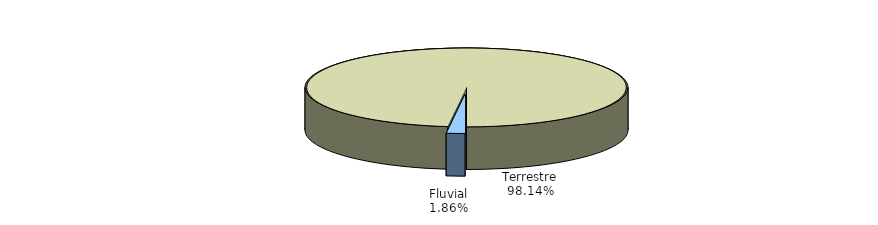
| Category | Series 0 |
|---|---|
| Fluvial | 1.86 |
| Terrestre | 98.14 |